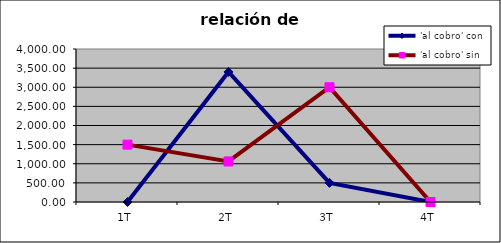
| Category | 'al cobro' con | 'al cobro' sin |
|---|---|---|
| 1T | 0 | 1500 |
| 2T | 3400 | 1060 |
| 3T | 500 | 3000 |
| 4T | 0 | 0 |